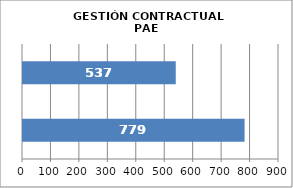
| Category | GESTIÓN CONTRACTUAL PAE |
|---|---|
| # Contratos Programados | 779 |
| # Contratos Suscritos | 537 |